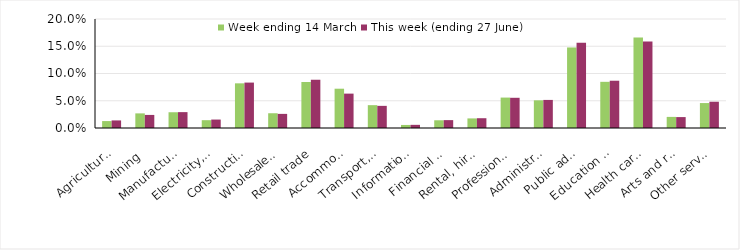
| Category | Week ending 14 March | This week (ending 27 June) |
|---|---|---|
| Agriculture, forestry and fishing | 0.013 | 0.014 |
| Mining | 0.027 | 0.024 |
| Manufacturing | 0.029 | 0.029 |
| Electricity, gas, water and waste services | 0.014 | 0.015 |
| Construction | 0.082 | 0.083 |
| Wholesale trade | 0.027 | 0.026 |
| Retail trade | 0.084 | 0.089 |
| Accommodation and food services | 0.072 | 0.063 |
| Transport, postal and warehousing | 0.042 | 0.041 |
| Information media and telecommunications | 0.006 | 0.006 |
| Financial and insurance services | 0.014 | 0.014 |
| Rental, hiring and real estate services | 0.018 | 0.018 |
| Professional, scientific and technical services | 0.056 | 0.055 |
| Administrative and support services | 0.051 | 0.052 |
| Public administration and safety | 0.148 | 0.156 |
| Education and training | 0.085 | 0.087 |
| Health care and social assistance | 0.166 | 0.159 |
| Arts and recreation services | 0.02 | 0.02 |
| Other services | 0.046 | 0.048 |